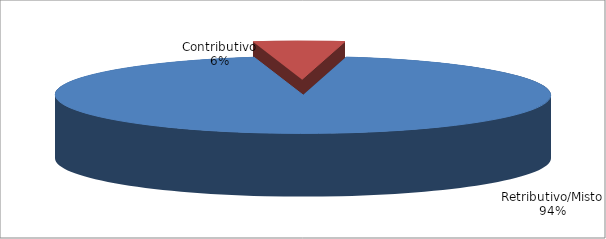
| Category | Series 1 |
|---|---|
| Retributivo/Misto | 39895 |
| Contributivo | 2519 |